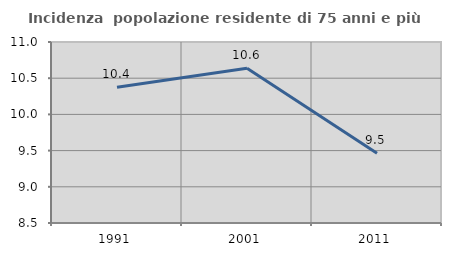
| Category | Incidenza  popolazione residente di 75 anni e più |
|---|---|
| 1991.0 | 10.375 |
| 2001.0 | 10.636 |
| 2011.0 | 9.462 |